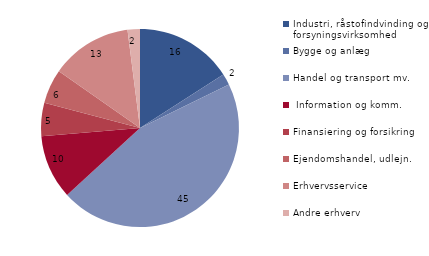
| Category | Series 0 |
|---|---|
| Industri, råstofindvinding og forsyningsvirksomhed | 15.912 |
| Bygge og anlæg | 1.829 |
| Handel og transport mv. | 45.442 |
|  Information og komm. | 10.48 |
| Finansiering og forsikring | 5.459 |
| Ejendomshandel, udlejn. | 5.595 |
| Erhvervsservice | 13.264 |
| Andre erhverv | 2.02 |